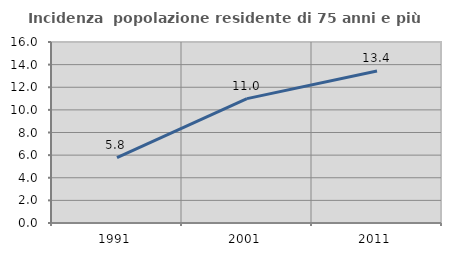
| Category | Incidenza  popolazione residente di 75 anni e più |
|---|---|
| 1991.0 | 5.784 |
| 2001.0 | 10.995 |
| 2011.0 | 13.429 |